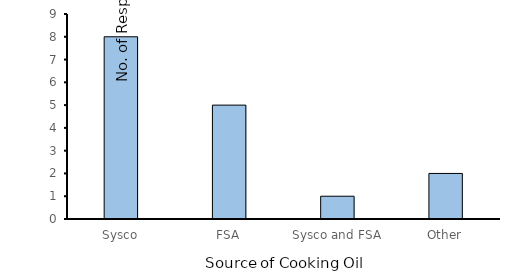
| Category | Series 0 |
|---|---|
| Sysco | 8 |
| FSA | 5 |
| Sysco and FSA | 1 |
| Other | 2 |